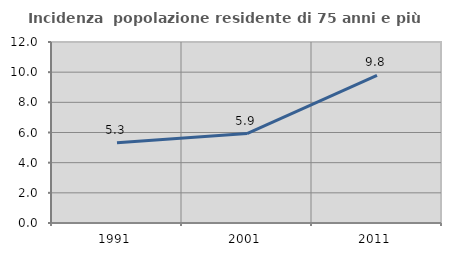
| Category | Incidenza  popolazione residente di 75 anni e più |
|---|---|
| 1991.0 | 5.327 |
| 2001.0 | 5.928 |
| 2011.0 | 9.782 |